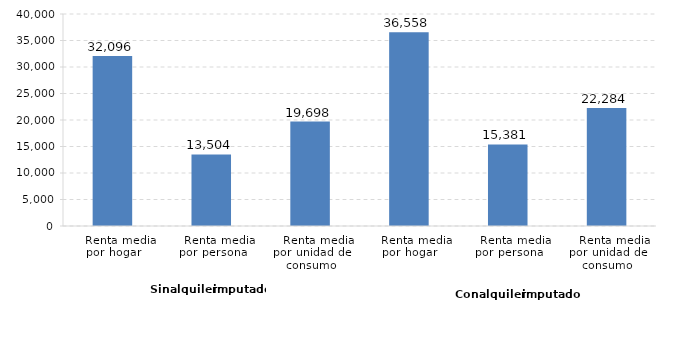
| Category | La Rioja |
|---|---|
|    Renta media por hogar | 32096 |
|    Renta media por persona | 13504 |
|    Renta media por unidad de consumo | 19698 |
|    Renta media por hogar | 36558 |
|    Renta media por persona | 15381 |
|    Renta media por unidad de consumo | 22284 |